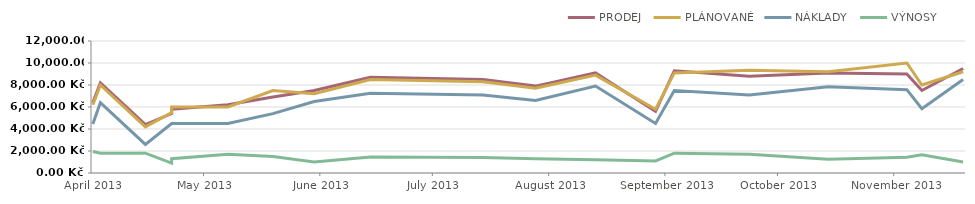
| Category | PRODEJ | PLÁNOVANÉ | NÁKLADY | VÝNOSY |
|---|---|---|---|---|
| 2013-04-23 | 6400 | 6200 | 4450 | 1950 |
| 2013-04-25 | 8200 | 8000 | 6400 | 1800 |
| 2013-05-07 | 4400 | 4200 | 2600 | 1800 |
| 2013-05-14 | 5400 | 5500 | 4500 | 900 |
| 2013-05-14 | 5800 | 6000 | 4500 | 1300 |
| 2013-05-29 | 6200 | 6000 | 4500 | 1700 |
| 2013-06-10 | 6900 | 7500 | 5400 | 1500 |
| 2013-06-21 | 7500 | 7200 | 6500 | 1000 |
| 2013-07-06 | 8700 | 8500 | 7250 | 1450 |
| 2013-08-05 | 8500 | 8300 | 7100 | 1400 |
| 2013-08-19 | 7900 | 7700 | 6600 | 1300 |
| 2013-09-04 | 9100 | 8900 | 7900 | 1200 |
| 2013-09-20 | 5600 | 5800 | 4500 | 1100 |
| 2013-09-25 | 9300 | 9100 | 7500 | 1800 |
| 2013-10-15 | 8800 | 9350 | 7100 | 1700 |
| 2013-11-05 | 9100 | 9200 | 7850 | 1250 |
| 2013-11-26 | 9000 | 10000 | 7575 | 1425 |
| 2013-11-30 | 7500 | 8000 | 5850 | 1650 |
| 2013-12-11 | 9500 | 9200 | 8500 | 1000 |